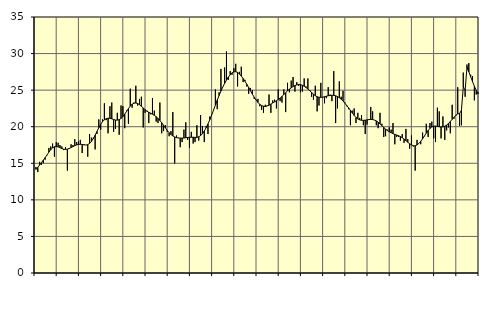
| Category | Piggar | Series 1 |
|---|---|---|
| nan | 14.5 | 14.16 |
| 1.0 | 13.8 | 14.44 |
| 1.0 | 15.2 | 14.76 |
| 1.0 | 14.8 | 15.09 |
| 1.0 | 15 | 15.43 |
| 1.0 | 15.5 | 15.79 |
| 1.0 | 16.1 | 16.14 |
| 1.0 | 17.1 | 16.52 |
| 1.0 | 17.3 | 16.86 |
| 1.0 | 17.7 | 17.11 |
| 1.0 | 15.9 | 17.26 |
| 1.0 | 17.9 | 17.29 |
| nan | 17.8 | 17.24 |
| 2.0 | 17.5 | 17.13 |
| 2.0 | 17.3 | 17.02 |
| 2.0 | 16.8 | 16.93 |
| 2.0 | 17.2 | 16.9 |
| 2.0 | 14 | 16.93 |
| 2.0 | 17 | 17.03 |
| 2.0 | 17.6 | 17.15 |
| 2.0 | 17.5 | 17.28 |
| 2.0 | 18.3 | 17.41 |
| 2.0 | 17.9 | 17.52 |
| 2.0 | 18 | 17.58 |
| nan | 18.2 | 17.6 |
| 3.0 | 16.4 | 17.57 |
| 3.0 | 17.6 | 17.52 |
| 3.0 | 17.5 | 17.5 |
| 3.0 | 15.9 | 17.55 |
| 3.0 | 19 | 17.71 |
| 3.0 | 18.5 | 17.99 |
| 3.0 | 18.5 | 18.37 |
| 3.0 | 16.9 | 18.84 |
| 3.0 | 19 | 19.35 |
| 3.0 | 21 | 19.86 |
| 3.0 | 19.6 | 20.32 |
| nan | 21 | 20.69 |
| 4.0 | 23.2 | 20.95 |
| 4.0 | 20.9 | 21.1 |
| 4.0 | 19.1 | 21.17 |
| 4.0 | 22.8 | 21.15 |
| 4.0 | 23.3 | 21.08 |
| 4.0 | 19.3 | 20.99 |
| 4.0 | 19.7 | 20.91 |
| 4.0 | 21.9 | 20.9 |
| 4.0 | 18.9 | 20.97 |
| 4.0 | 22.9 | 21.13 |
| 4.0 | 22.8 | 21.38 |
| nan | 19.8 | 21.72 |
| 5.0 | 22.2 | 22.09 |
| 5.0 | 20.4 | 22.47 |
| 5.0 | 25.2 | 22.82 |
| 5.0 | 22.6 | 23.08 |
| 5.0 | 23.3 | 23.22 |
| 5.0 | 25.6 | 23.24 |
| 5.0 | 22.9 | 23.17 |
| 5.0 | 23.8 | 23.01 |
| 5.0 | 24.1 | 22.79 |
| 5.0 | 19.9 | 22.56 |
| 5.0 | 21.9 | 22.33 |
| nan | 22.2 | 22.12 |
| 6.0 | 20.5 | 21.97 |
| 6.0 | 21.7 | 21.85 |
| 6.0 | 23.9 | 21.71 |
| 6.0 | 22.2 | 21.56 |
| 6.0 | 20.7 | 21.37 |
| 6.0 | 20.5 | 21.14 |
| 6.0 | 23.3 | 20.85 |
| 6.0 | 19.1 | 20.54 |
| 6.0 | 19.4 | 20.19 |
| 6.0 | 20.2 | 19.83 |
| 6.0 | 19.3 | 19.48 |
| nan | 18.7 | 19.18 |
| 7.0 | 19.4 | 18.93 |
| 7.0 | 22 | 18.74 |
| 7.0 | 15 | 18.6 |
| 7.0 | 18.8 | 18.51 |
| 7.0 | 18.5 | 18.46 |
| 7.0 | 17.2 | 18.44 |
| 7.0 | 17.9 | 18.44 |
| 7.0 | 19.6 | 18.46 |
| 7.0 | 20.6 | 18.49 |
| 7.0 | 18.2 | 18.53 |
| 7.0 | 17.1 | 18.55 |
| nan | 19.3 | 18.56 |
| 8.0 | 17.7 | 18.56 |
| 8.0 | 17.9 | 18.54 |
| 8.0 | 20.2 | 18.54 |
| 8.0 | 18.1 | 18.62 |
| 8.0 | 21.6 | 18.78 |
| 8.0 | 20.1 | 19.04 |
| 8.0 | 17.9 | 19.41 |
| 8.0 | 20.1 | 19.86 |
| 8.0 | 19 | 20.38 |
| 8.0 | 21.4 | 20.96 |
| 8.0 | 21.6 | 21.6 |
| nan | 22.3 | 22.27 |
| 9.0 | 25.1 | 22.95 |
| 9.0 | 22.4 | 23.62 |
| 9.0 | 24.7 | 24.26 |
| 9.0 | 27.9 | 24.86 |
| 9.0 | 25.4 | 25.42 |
| 9.0 | 28.1 | 25.92 |
| 9.0 | 30.3 | 26.37 |
| 9.0 | 26.4 | 26.78 |
| 9.0 | 27.6 | 27.11 |
| 9.0 | 27.1 | 27.36 |
| 9.0 | 28 | 27.5 |
| nan | 28.6 | 27.52 |
| 10.0 | 25.5 | 27.42 |
| 10.0 | 27.5 | 27.21 |
| 10.0 | 28.2 | 26.93 |
| 10.0 | 26.1 | 26.59 |
| 10.0 | 26.4 | 26.21 |
| 10.0 | 25.5 | 25.8 |
| 10.0 | 24.5 | 25.36 |
| 10.0 | 25.3 | 24.9 |
| 10.0 | 25 | 24.45 |
| 10.0 | 23.8 | 24.03 |
| 10.0 | 23.7 | 23.65 |
| nan | 23.8 | 23.32 |
| 11.0 | 22.8 | 23.06 |
| 11.0 | 22.3 | 22.89 |
| 11.0 | 21.9 | 22.79 |
| 11.0 | 23 | 22.77 |
| 11.0 | 22.9 | 22.83 |
| 11.0 | 24.4 | 22.94 |
| 11.0 | 21.9 | 23.09 |
| 11.0 | 23.6 | 23.25 |
| 11.0 | 23.7 | 23.4 |
| 11.0 | 22.5 | 23.56 |
| 11.0 | 25.1 | 23.73 |
| nan | 23.5 | 23.92 |
| 12.0 | 23.3 | 24.14 |
| 12.0 | 25.1 | 24.39 |
| 12.0 | 22 | 24.65 |
| 12.0 | 26 | 24.9 |
| 12.0 | 24.7 | 25.13 |
| 12.0 | 26.3 | 25.32 |
| 12.0 | 26.8 | 25.49 |
| 12.0 | 24.8 | 25.63 |
| 12.0 | 26.1 | 25.72 |
| 12.0 | 25.6 | 25.77 |
| 12.0 | 24.7 | 25.75 |
| nan | 24.8 | 25.67 |
| 13.0 | 26.6 | 25.53 |
| 13.0 | 25.5 | 25.36 |
| 13.0 | 26.6 | 25.15 |
| 13.0 | 25 | 24.92 |
| 13.0 | 24.1 | 24.69 |
| 13.0 | 23.7 | 24.45 |
| 13.0 | 25.6 | 24.24 |
| 13.0 | 22.1 | 24.1 |
| 13.0 | 22.9 | 24.03 |
| 13.0 | 26 | 24.01 |
| 13.0 | 24 | 24.04 |
| nan | 23.2 | 24.1 |
| 14.0 | 23.9 | 24.17 |
| 14.0 | 25.4 | 24.23 |
| 14.0 | 24.4 | 24.27 |
| 14.0 | 23.5 | 24.3 |
| 14.0 | 27.6 | 24.28 |
| 14.0 | 20.5 | 24.23 |
| 14.0 | 22.5 | 24.13 |
| 14.0 | 26.2 | 23.97 |
| 14.0 | 24.1 | 23.77 |
| 14.0 | 24.9 | 23.51 |
| 14.0 | 23.3 | 23.22 |
| nan | 22.8 | 22.9 |
| 15.0 | 22.4 | 22.58 |
| 15.0 | 20.2 | 22.24 |
| 15.0 | 22.2 | 21.89 |
| 15.0 | 22.5 | 21.55 |
| 15.0 | 20.5 | 21.27 |
| 15.0 | 21.9 | 21.06 |
| 15.0 | 21.2 | 20.94 |
| 15.0 | 21.6 | 20.88 |
| 15.0 | 20.2 | 20.87 |
| 15.0 | 19 | 20.89 |
| 15.0 | 20.3 | 20.94 |
| nan | 21 | 20.98 |
| 16.0 | 22.7 | 21 |
| 16.0 | 22.1 | 20.98 |
| 16.0 | 20.9 | 20.91 |
| 16.0 | 20.2 | 20.79 |
| 16.0 | 19.8 | 20.61 |
| 16.0 | 21.9 | 20.39 |
| 16.0 | 20.4 | 20.15 |
| 16.0 | 18.6 | 19.9 |
| 16.0 | 18.7 | 19.67 |
| 16.0 | 19.6 | 19.47 |
| 16.0 | 19.9 | 19.31 |
| nan | 19.6 | 19.18 |
| 17.0 | 20.5 | 19.06 |
| 17.0 | 17.6 | 18.95 |
| 17.0 | 18.6 | 18.86 |
| 17.0 | 18.6 | 18.77 |
| 17.0 | 18.1 | 18.65 |
| 17.0 | 19 | 18.5 |
| 17.0 | 17.8 | 18.31 |
| 17.0 | 19.7 | 18.09 |
| 17.0 | 18.3 | 17.88 |
| 17.0 | 17 | 17.68 |
| 17.0 | 18.8 | 17.51 |
| nan | 17.3 | 17.4 |
| 18.0 | 14 | 17.4 |
| 18.0 | 18.2 | 17.5 |
| 18.0 | 17.7 | 17.71 |
| 18.0 | 17.6 | 18 |
| 18.0 | 19.2 | 18.35 |
| 18.0 | 18.7 | 18.74 |
| 18.0 | 20.4 | 19.13 |
| 18.0 | 18.6 | 19.48 |
| 18.0 | 20.5 | 19.77 |
| 18.0 | 20.7 | 19.97 |
| 18.0 | 18.4 | 20.07 |
| nan | 17.9 | 20.09 |
| 19.0 | 22.6 | 20.05 |
| 19.0 | 22.1 | 20 |
| 19.0 | 18.4 | 19.97 |
| 19.0 | 21.4 | 19.98 |
| 19.0 | 18.2 | 20.07 |
| 19.0 | 19.5 | 20.22 |
| 19.0 | 19.9 | 20.44 |
| 19.0 | 19.1 | 20.71 |
| 19.0 | 23 | 21.01 |
| 19.0 | 21.1 | 21.3 |
| 19.0 | 21.5 | 21.57 |
| nan | 25.4 | 21.75 |
| 20.0 | 20.1 | 21.81 |
| 20.0 | 20.2 | 22.23 |
| 20.0 | 27.4 | 25.44 |
| 20.0 | 24.1 | 24.99 |
| 20.0 | 28.5 | 28.16 |
| 20.0 | 28.7 | 27.52 |
| 20.0 | 27.1 | 26.84 |
| 20.0 | 26.9 | 26.17 |
| 20.0 | 23.6 | 25.54 |
| 20.0 | 24.4 | 24.97 |
| 20.0 | 24.7 | 24.49 |